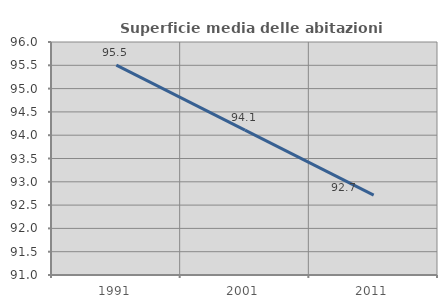
| Category | Superficie media delle abitazioni occupate |
|---|---|
| 1991.0 | 95.502 |
| 2001.0 | 94.108 |
| 2011.0 | 92.713 |